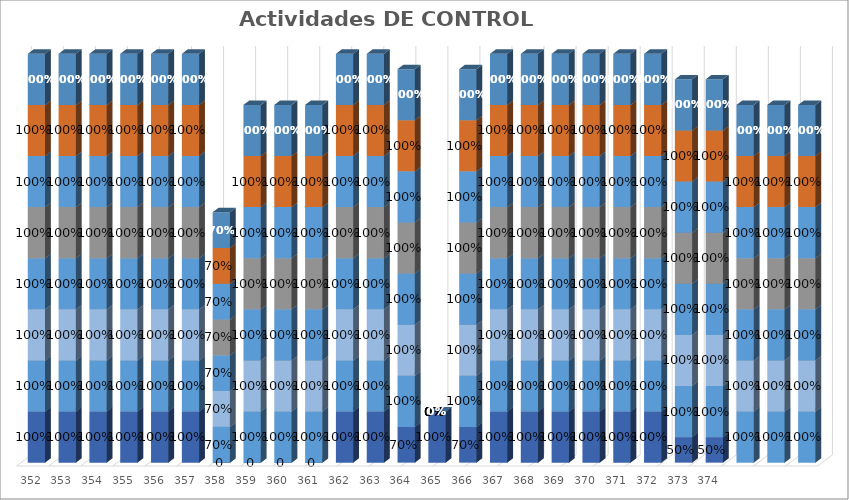
| Category | % Avance |
|---|---|
| 352.0 | 1 |
| 353.0 | 1 |
| 354.0 | 1 |
| 355.0 | 1 |
| 356.0 | 1 |
| 357.0 | 1 |
| 358.0 | 0.7 |
| 359.0 | 1 |
| 360.0 | 1 |
| 361.0 | 1 |
| 362.0 | 1 |
| 363.0 | 1 |
| 364.0 | 1 |
| 365.0 | 0 |
| 366.0 | 1 |
| 367.0 | 1 |
| 368.0 | 1 |
| 369.0 | 1 |
| 370.0 | 1 |
| 371.0 | 1 |
| 372.0 | 1 |
| 373.0 | 1 |
| 374.0 | 1 |